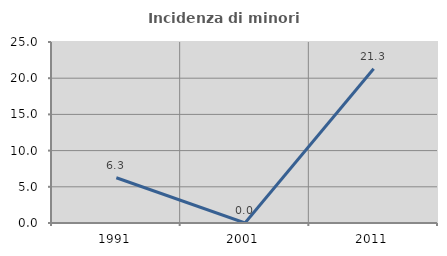
| Category | Incidenza di minori stranieri |
|---|---|
| 1991.0 | 6.25 |
| 2001.0 | 0 |
| 2011.0 | 21.311 |